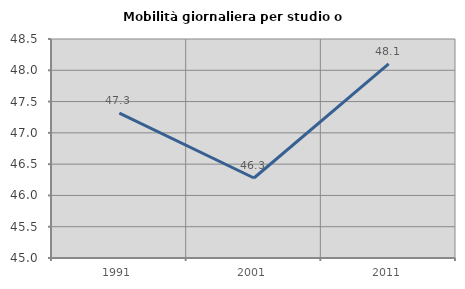
| Category | Mobilità giornaliera per studio o lavoro |
|---|---|
| 1991.0 | 47.315 |
| 2001.0 | 46.278 |
| 2011.0 | 48.103 |